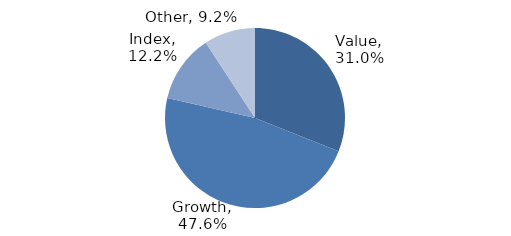
| Category | Investment Style |
|---|---|
| Value | 0.31 |
| Growth | 0.476 |
| Index | 0.122 |
| Other | 0.092 |